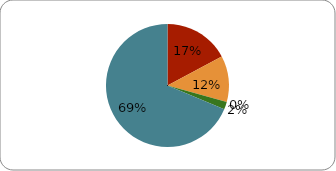
| Category | Series 0 |
|---|---|
| 0 | 0.17 |
| 1 | 0.12 |
| 2 | 0 |
| 3 | 0.02 |
| 4 | 0.68 |